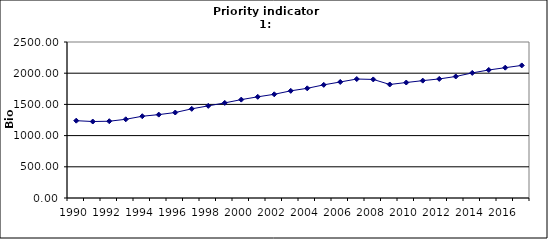
| Category | GDP, Bio Euro (EC95) |
|---|---|
| 1990 | 1239.155 |
| 1991 | 1225.691 |
| 1992 | 1230.275 |
| 1993 | 1261.363 |
| 1994 | 1310.304 |
| 1995 | 1336.146 |
| 1996 | 1370.02 |
| 1997 | 1428.837 |
| 1998 | 1476.578 |
| 1999 | 1524.033 |
| 2000 | 1576.665 |
| 2001 | 1621.453 |
| 2002 | 1661.985 |
| 2003 | 1717.486 |
| 2004 | 1757.81 |
| 2005 | 1813.158 |
| 2006 | 1859.359 |
| 2007 | 1906.689 |
| 2008 | 1900.094 |
| 2009 | 1819.405 |
| 2010 | 1850.539 |
| 2011 | 1880.976 |
| 2012 | 1908.194 |
| 2013 | 1947.243 |
| 2014 | 2004.639 |
| 2015 | 2051.731 |
| 2016 | 2088.441 |
| 2017 | 2124.804 |